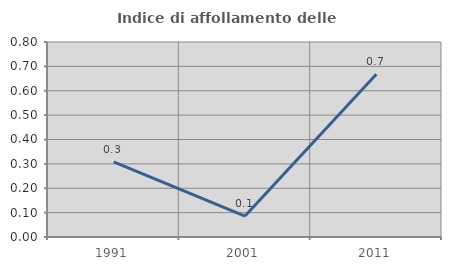
| Category | Indice di affollamento delle abitazioni  |
|---|---|
| 1991.0 | 0.308 |
| 2001.0 | 0.086 |
| 2011.0 | 0.668 |